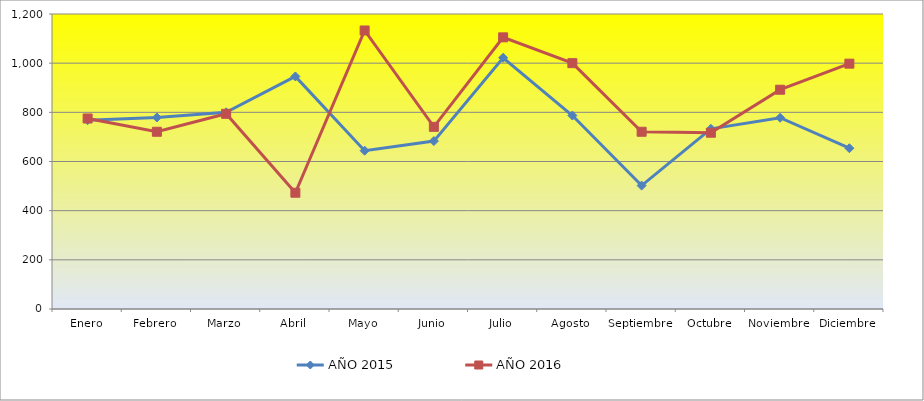
| Category | AÑO 2015 | AÑO 2016 |
|---|---|---|
| Enero | 768 | 775 |
| Febrero | 779 | 721 |
| Marzo | 800 | 794 |
| Abril | 946 | 473 |
| Mayo | 644 | 1133 |
| Junio | 683 | 741 |
| Julio | 1022 | 1105 |
| Agosto | 787 | 1000 |
| Septiembre | 502 | 721 |
| Octubre | 733 | 717 |
| Noviembre | 778 | 892 |
| Diciembre | 654 | 998 |